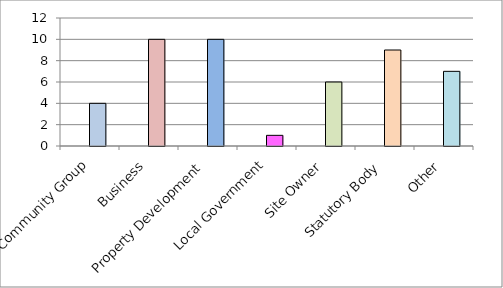
| Category | Series 0 | Total |
|---|---|---|
| Community Group |  | 4 |
| Business |  | 10 |
| Property Development |  | 10 |
| Local Government |  | 1 |
| Site Owner |  | 6 |
| Statutory Body |  | 9 |
| Other |  | 7 |